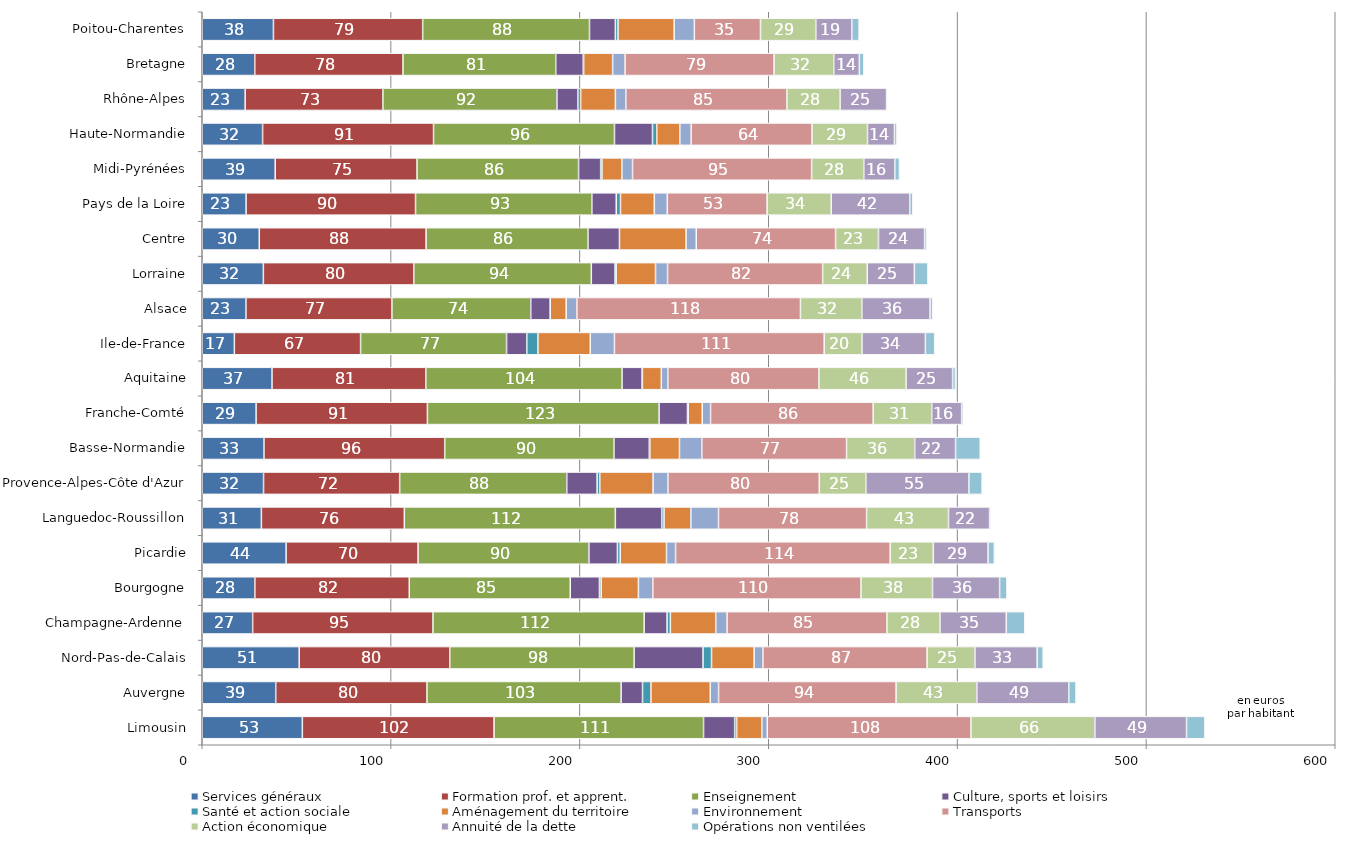
| Category | Services généraux | Formation prof. et apprent. | Enseignement | Culture, sports et loisirs | Santé et action sociale | Aménagement du territoire | Environnement | Transports | Action économique | Annuité de la dette | Opérations non ventilées |
|---|---|---|---|---|---|---|---|---|---|---|---|
| Limousin | 53.01 | 101.506 | 110.962 | 16.471 | 1.057 | 13.332 | 2.862 | 107.907 | 65.592 | 48.549 | 9.715 |
| Auvergne | 38.913 | 80.091 | 102.82 | 11.341 | 4.444 | 31.432 | 4.374 | 94.015 | 42.757 | 48.699 | 3.833 |
| Nord-Pas-de-Calais | 51.336 | 79.747 | 97.623 | 36.485 | 4.511 | 22.551 | 4.668 | 86.929 | 25.333 | 32.957 | 3.185 |
| Champagne-Ardenne | 26.694 | 95.485 | 111.851 | 12.137 | 1.744 | 24.013 | 6.011 | 84.678 | 28.078 | 35.105 | 9.819 |
| Bourgogne | 27.855 | 81.78 | 85.249 | 15.458 | 0.918 | 19.727 | 7.627 | 110.25 | 37.865 | 35.52 | 3.872 |
| Picardie | 44.409 | 69.884 | 90.483 | 15.085 | 1.496 | 24.489 | 4.807 | 113.652 | 22.847 | 28.998 | 3.327 |
| Languedoc-Roussillon | 31.315 | 75.707 | 111.747 | 24.572 | 1.207 | 14.192 | 14.654 | 78.428 | 43.379 | 21.739 | 0.515 |
| Provence-Alpes-Côte d'Azur | 32.454 | 72.086 | 88.493 | 16.072 | 1.412 | 28.24 | 7.838 | 80.174 | 24.637 | 54.569 | 7.023 |
| Basse-Normandie | 32.681 | 95.726 | 89.625 | 18.705 | 0.306 | 15.688 | 11.804 | 76.658 | 36.108 | 21.621 | 13.06 |
| Franche-Comté | 28.514 | 90.725 | 122.695 | 15.023 | 0.39 | 7.45 | 4.394 | 86.109 | 31.01 | 15.842 | 0.845 |
| Aquitaine | 36.941 | 81.452 | 103.926 | 10.629 | 0.136 | 10.029 | 3.444 | 80.013 | 46.158 | 24.646 | 1.511 |
| Ile-de-France | 17.007 | 66.844 | 77.304 | 10.707 | 5.906 | 27.727 | 12.78 | 111.091 | 20.007 | 33.583 | 4.94 |
| Alsace | 23.13 | 77.306 | 73.53 | 10.318 | 0.009 | 8.453 | 5.649 | 118.401 | 32.495 | 36.132 | 1.392 |
| Lorraine | 32.374 | 79.651 | 94.016 | 12.568 | 0.594 | 20.837 | 6.378 | 82.125 | 23.615 | 24.95 | 7.186 |
| Centre | 30.207 | 88.326 | 85.741 | 16.663 | 0 | 35.288 | 5.382 | 73.779 | 22.737 | 24.385 | 1.041 |
| Pays de la Loire | 23.214 | 89.735 | 93.382 | 12.903 | 2.271 | 17.9 | 6.873 | 52.865 | 33.941 | 41.588 | 1.626 |
| Midi-Pyrénées | 38.627 | 75.13 | 85.539 | 11.693 | 0.683 | 10.559 | 5.645 | 94.826 | 27.638 | 16.402 | 2.469 |
| Haute-Normandie | 31.959 | 90.523 | 95.823 | 20.134 | 2.262 | 12.223 | 5.98 | 63.993 | 29.413 | 14.256 | 1.317 |
| Rhône-Alpes | 22.725 | 72.943 | 92.164 | 11.071 | 1.494 | 18.388 | 5.529 | 85.289 | 28.178 | 24.611 | 0.189 |
| Bretagne | 27.805 | 78.498 | 80.899 | 14.573 | 0.211 | 15.343 | 6.592 | 78.891 | 31.615 | 13.551 | 2.388 |
| Poitou-Charentes | 37.699 | 79.028 | 88.343 | 13.706 | 1.396 | 29.737 | 10.7 | 35.017 | 29.305 | 19.036 | 3.877 |